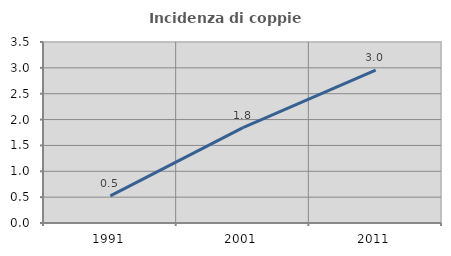
| Category | Incidenza di coppie miste |
|---|---|
| 1991.0 | 0.525 |
| 2001.0 | 1.846 |
| 2011.0 | 2.957 |